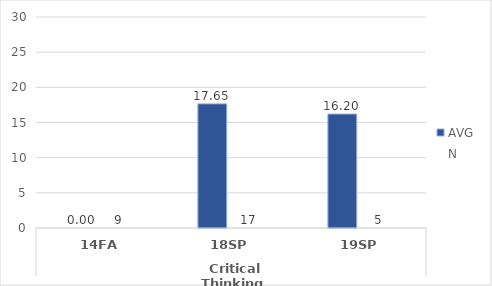
| Category | Human Services - AVG | Human Services - N |
|---|---|---|
| 0 | 0 | 9 |
| 1 | 17.647 | 17 |
| 2 | 16.2 | 5 |